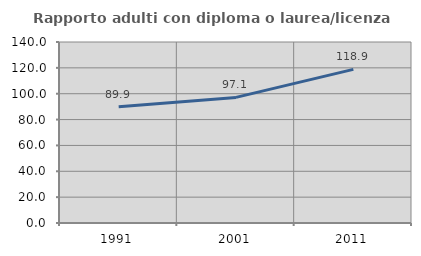
| Category | Rapporto adulti con diploma o laurea/licenza media  |
|---|---|
| 1991.0 | 89.908 |
| 2001.0 | 97.143 |
| 2011.0 | 118.852 |